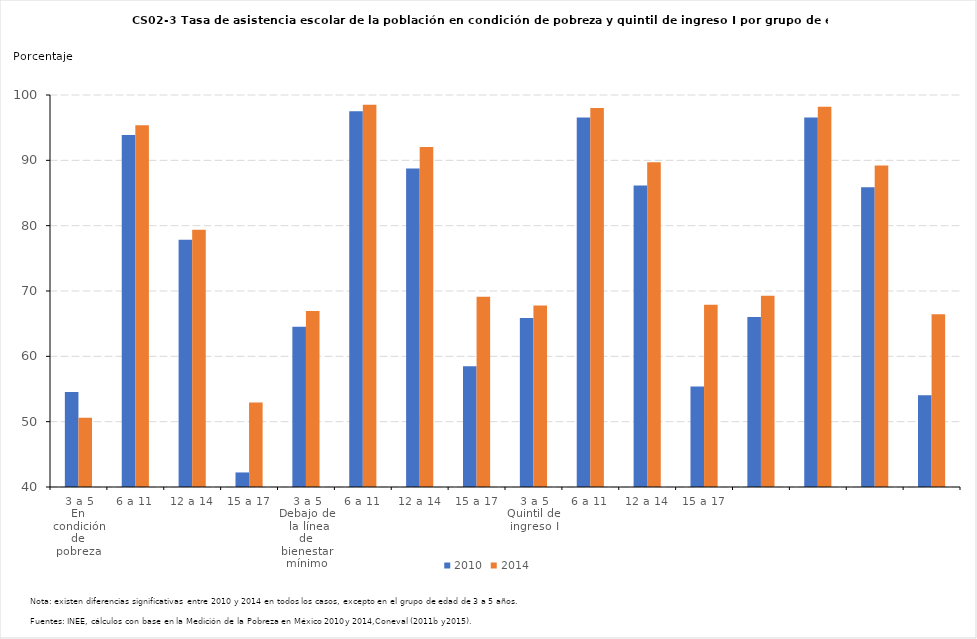
| Category | 2010 | 2014 |
|---|---|---|
| 0 | 54.547 | 50.606 |
| 1 | 93.879 | 95.365 |
| 2 | 77.832 | 79.392 |
| 3 | 42.228 | 52.951 |
| 4 | 64.538 | 66.932 |
| 5 | 97.526 | 98.492 |
| 6 | 88.737 | 92.058 |
| 7 | 58.48 | 69.102 |
| 8 | 65.882 | 67.782 |
| 9 | 96.544 | 98.023 |
| 10 | 86.132 | 89.694 |
| 11 | 55.364 | 67.907 |
| 12 | 66.016 | 69.289 |
| 13 | 96.54 | 98.199 |
| 14 | 85.886 | 89.196 |
| 15 | 54.057 | 66.454 |